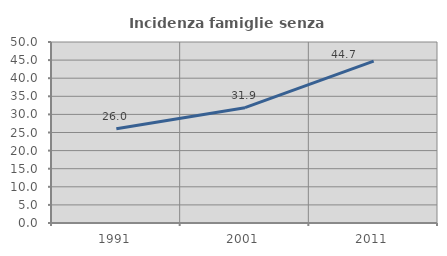
| Category | Incidenza famiglie senza nuclei |
|---|---|
| 1991.0 | 26.007 |
| 2001.0 | 31.853 |
| 2011.0 | 44.737 |